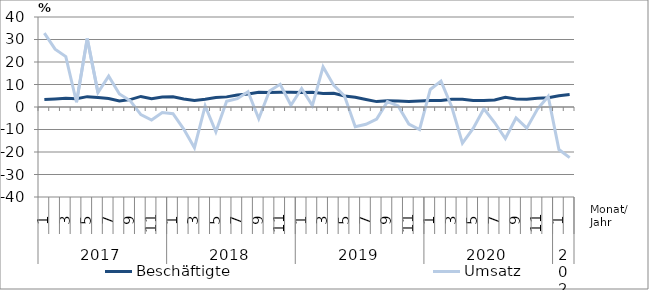
| Category | Beschäftigte | Umsatz |
|---|---|---|
| 0 | 3.3 | 32.8 |
| 1 | 3.6 | 25.7 |
| 2 | 3.9 | 22.4 |
| 3 | 3.7 | 2.1 |
| 4 | 4.6 | 30.4 |
| 5 | 4.2 | 6.4 |
| 6 | 3.8 | 13.7 |
| 7 | 2.7 | 5.8 |
| 8 | 3.3 | 2.8 |
| 9 | 4.7 | -3.4 |
| 10 | 3.7 | -5.8 |
| 11 | 4.4 | -2.5 |
| 12 | 4.5 | -3 |
| 13 | 3.6 | -9.8 |
| 14 | 2.9 | -18.1 |
| 15 | 3.4 | 0.5 |
| 16 | 4.2 | -11 |
| 17 | 4.5 | 2.5 |
| 18 | 5.3 | 3.7 |
| 19 | 5.8 | 6.8 |
| 20 | 6.6 | -5.2 |
| 21 | 6.5 | 7.1 |
| 22 | 6.6 | 10.1 |
| 23 | 6.6 | 0.8 |
| 24 | 6.4 | 8.2 |
| 25 | 6.5 | 0.6 |
| 26 | 6 | 17.8 |
| 27 | 6.1 | 9.6 |
| 28 | 4.9 | 4.9 |
| 29 | 4.3 | -8.8 |
| 30 | 3.3 | -7.7 |
| 31 | 2.4 | -5.4 |
| 32 | 2.8 | 2.4 |
| 33 | 2.7 | 0.5 |
| 34 | 2.5 | -7.6 |
| 35 | 2.7 | -10 |
| 36 | 2.9 | 7.8 |
| 37 | 2.9 | 11.5 |
| 38 | 3.4 | 0.1 |
| 39 | 3.4 | -16.1 |
| 40 | 2.9 | -9.5 |
| 41 | 2.9 | -0.8 |
| 42 | 3.1 | -6.9 |
| 43 | 4.3 | -14 |
| 44 | 3.6 | -4.9 |
| 45 | 3.4 | -9.4 |
| 46 | 3.9 | -0.9 |
| 47 | 4.1 | 4.7 |
| 48 | 5 | -18.9 |
| 49 | 5.6 | -22.5 |